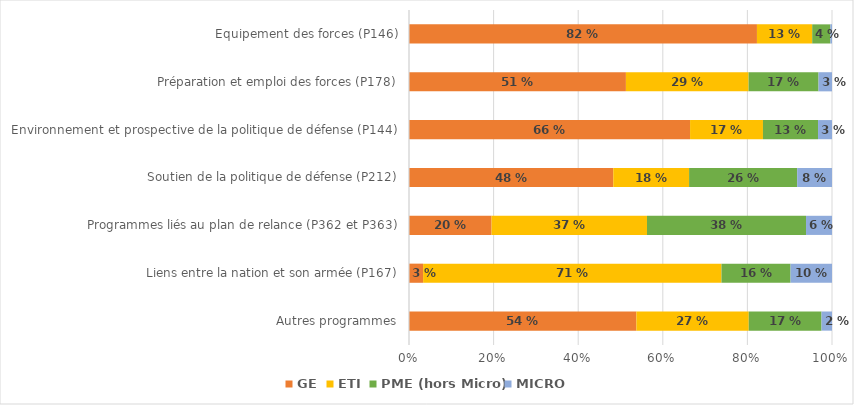
| Category | GE | ETI | PME (hors Micro) | MICRO |
|---|---|---|---|---|
| Autres programmes | 53.76 | 26.56 | 17.2 | 2.48 |
| Liens entre la nation et son armée (P167) | 3.34 | 70.53 | 16.33 | 9.8 |
| Programmes liés au plan de relance (P362 et P363) | 19.52 | 36.75 | 37.6 | 6.14 |
| Soutien de la politique de défense (P212) | 48.29 | 17.92 | 25.55 | 8.23 |
| Environnement et prospective de la politique de défense (P144) | 66.44 | 17.23 | 13.02 | 3.3 |
| Préparation et emploi des forces (P178) | 51.28 | 29 | 16.54 | 3.18 |
| Equipement des forces (P146) | 82.25 | 13.06 | 4.29 | 0.39 |